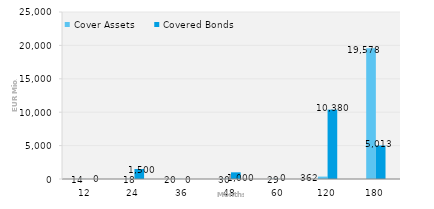
| Category | Cover Assets | Covered Bonds |
|---|---|---|
| 12.0 | 13.853 | 0 |
| 24.0 | 17.745 | 1500 |
| 36.0 | 20.297 | 0 |
| 48.0 | 29.506 | 1000 |
| 60.0 | 28.682 | 0 |
| 120.0 | 361.549 | 10380 |
| 180.0 | 19578.309 | 5013 |